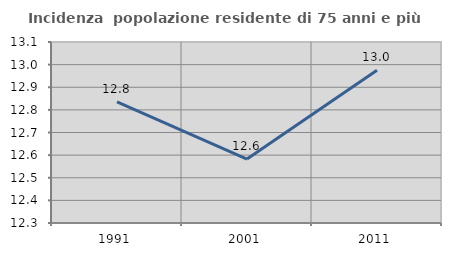
| Category | Incidenza  popolazione residente di 75 anni e più |
|---|---|
| 1991.0 | 12.835 |
| 2001.0 | 12.583 |
| 2011.0 | 12.975 |